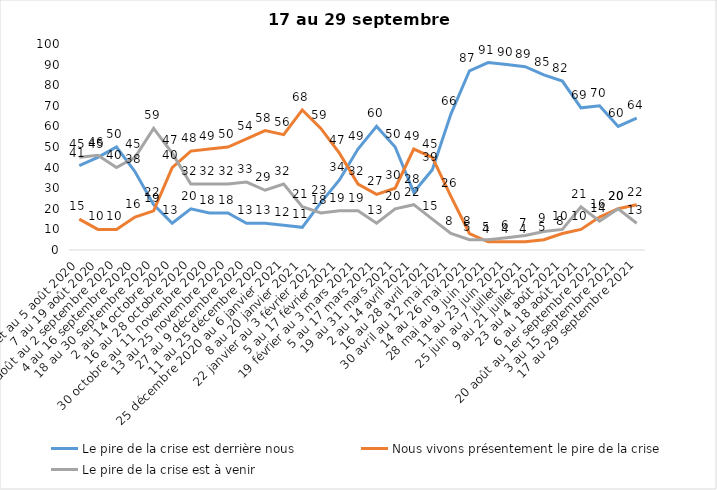
| Category | Le pire de la crise est derrière nous | Nous vivons présentement le pire de la crise | Le pire de la crise est à venir |
|---|---|---|---|
| 24 juillet au 5 août 2020 | 41 | 15 | 45 |
| 7 au 19 août 2020 | 45 | 10 | 46 |
| 21 août au 2 septembre 2020 | 50 | 10 | 40 |
| 4 au 16 septembre 2020 | 38 | 16 | 45 |
| 18 au 30 septembre 2020 | 22 | 19 | 59 |
| 2 au 14 octobre 2020 | 13 | 40 | 47 |
| 16 au 28 octobre 2020 | 20 | 48 | 32 |
| 30 octobre au 11 novembre 2020 | 18 | 49 | 32 |
| 13 au 25 novembre 2020 | 18 | 50 | 32 |
| 27 au 9 décembre 2020 | 13 | 54 | 33 |
| 11 au 25 décembre 2020 | 13 | 58 | 29 |
| 25 décembre 2020 au 6 janvier 2021 | 12 | 56 | 32 |
| 8 au 20 janvier 2021 | 11 | 68 | 21 |
| 22 janvier au 3 février 2021 | 23 | 59 | 18 |
| 5 au 17 février 2021 | 34 | 47 | 19 |
| 19 février au 3 mars 2021 | 49 | 32 | 19 |
| 5 au 17 mars 2021 | 60 | 27 | 13 |
| 19 au 31 mars 2021 | 50 | 30 | 20 |
| 2 au 14 avril 2021 | 28 | 49 | 22 |
| 16 au 28 avril 2021 | 39 | 45 | 15 |
| 30 avril au 12 mai 2021 | 66 | 26 | 8 |
| 14 au 26 mai 2021 | 87 | 8 | 5 |
| 28 mai au 9 juin 2021 | 91 | 4 | 5 |
| 11 au 23 juin 2021 | 90 | 4 | 6 |
| 25 juin au 7 juillet 2021 | 89 | 4 | 7 |
| 9 au 21 juillet 2021 | 85 | 5 | 9 |
| 23 au 4 août 2021 | 82 | 8 | 10 |
| 6 au 18 août 2021 | 69 | 10 | 21 |
| 20 août au 1er septembre 2021 | 70 | 16 | 14 |
| 3 au 15 septembre 2021 | 60 | 20 | 20 |
| 17 au 29 septembre 2021 | 64 | 22 | 13 |